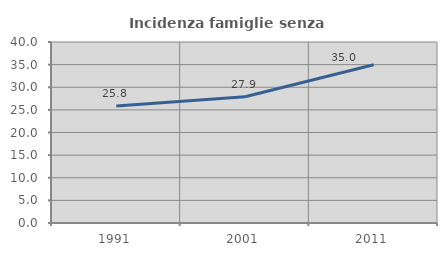
| Category | Incidenza famiglie senza nuclei |
|---|---|
| 1991.0 | 25.848 |
| 2001.0 | 27.892 |
| 2011.0 | 34.973 |